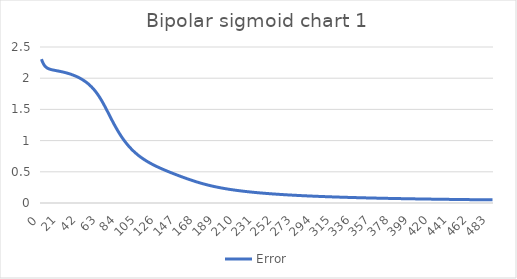
| Category | Error |
|---|---|
| 0.0 | 2.305 |
| 1.0 | 2.265 |
| 2.0 | 2.233 |
| 3.0 | 2.208 |
| 4.0 | 2.19 |
| 5.0 | 2.175 |
| 6.0 | 2.164 |
| 7.0 | 2.156 |
| 8.0 | 2.149 |
| 9.0 | 2.144 |
| 10.0 | 2.14 |
| 11.0 | 2.136 |
| 12.0 | 2.132 |
| 13.0 | 2.129 |
| 14.0 | 2.126 |
| 15.0 | 2.123 |
| 16.0 | 2.121 |
| 17.0 | 2.118 |
| 18.0 | 2.115 |
| 19.0 | 2.112 |
| 20.0 | 2.109 |
| 21.0 | 2.106 |
| 22.0 | 2.103 |
| 23.0 | 2.099 |
| 24.0 | 2.096 |
| 25.0 | 2.092 |
| 26.0 | 2.088 |
| 27.0 | 2.084 |
| 28.0 | 2.08 |
| 29.0 | 2.076 |
| 30.0 | 2.071 |
| 31.0 | 2.066 |
| 32.0 | 2.061 |
| 33.0 | 2.056 |
| 34.0 | 2.05 |
| 35.0 | 2.044 |
| 36.0 | 2.038 |
| 37.0 | 2.032 |
| 38.0 | 2.025 |
| 39.0 | 2.018 |
| 40.0 | 2.011 |
| 41.0 | 2.003 |
| 42.0 | 1.995 |
| 43.0 | 1.986 |
| 44.0 | 1.977 |
| 45.0 | 1.968 |
| 46.0 | 1.958 |
| 47.0 | 1.948 |
| 48.0 | 1.937 |
| 49.0 | 1.925 |
| 50.0 | 1.913 |
| 51.0 | 1.901 |
| 52.0 | 1.887 |
| 53.0 | 1.873 |
| 54.0 | 1.858 |
| 55.0 | 1.842 |
| 56.0 | 1.826 |
| 57.0 | 1.808 |
| 58.0 | 1.79 |
| 59.0 | 1.77 |
| 60.0 | 1.75 |
| 61.0 | 1.729 |
| 62.0 | 1.706 |
| 63.0 | 1.683 |
| 64.0 | 1.658 |
| 65.0 | 1.633 |
| 66.0 | 1.607 |
| 67.0 | 1.58 |
| 68.0 | 1.552 |
| 69.0 | 1.524 |
| 70.0 | 1.495 |
| 71.0 | 1.466 |
| 72.0 | 1.437 |
| 73.0 | 1.408 |
| 74.0 | 1.379 |
| 75.0 | 1.35 |
| 76.0 | 1.321 |
| 77.0 | 1.292 |
| 78.0 | 1.265 |
| 79.0 | 1.237 |
| 80.0 | 1.211 |
| 81.0 | 1.184 |
| 82.0 | 1.159 |
| 83.0 | 1.134 |
| 84.0 | 1.11 |
| 85.0 | 1.087 |
| 86.0 | 1.064 |
| 87.0 | 1.042 |
| 88.0 | 1.021 |
| 89.0 | 1 |
| 90.0 | 0.98 |
| 91.0 | 0.961 |
| 92.0 | 0.943 |
| 93.0 | 0.925 |
| 94.0 | 0.908 |
| 95.0 | 0.891 |
| 96.0 | 0.875 |
| 97.0 | 0.86 |
| 98.0 | 0.845 |
| 99.0 | 0.83 |
| 100.0 | 0.817 |
| 101.0 | 0.803 |
| 102.0 | 0.79 |
| 103.0 | 0.778 |
| 104.0 | 0.766 |
| 105.0 | 0.754 |
| 106.0 | 0.742 |
| 107.0 | 0.732 |
| 108.0 | 0.721 |
| 109.0 | 0.711 |
| 110.0 | 0.7 |
| 111.0 | 0.691 |
| 112.0 | 0.681 |
| 113.0 | 0.672 |
| 114.0 | 0.663 |
| 115.0 | 0.654 |
| 116.0 | 0.646 |
| 117.0 | 0.637 |
| 118.0 | 0.629 |
| 119.0 | 0.621 |
| 120.0 | 0.614 |
| 121.0 | 0.606 |
| 122.0 | 0.599 |
| 123.0 | 0.591 |
| 124.0 | 0.584 |
| 125.0 | 0.577 |
| 126.0 | 0.57 |
| 127.0 | 0.563 |
| 128.0 | 0.557 |
| 129.0 | 0.55 |
| 130.0 | 0.543 |
| 131.0 | 0.537 |
| 132.0 | 0.531 |
| 133.0 | 0.524 |
| 134.0 | 0.518 |
| 135.0 | 0.512 |
| 136.0 | 0.506 |
| 137.0 | 0.5 |
| 138.0 | 0.494 |
| 139.0 | 0.488 |
| 140.0 | 0.482 |
| 141.0 | 0.476 |
| 142.0 | 0.47 |
| 143.0 | 0.464 |
| 144.0 | 0.458 |
| 145.0 | 0.453 |
| 146.0 | 0.447 |
| 147.0 | 0.441 |
| 148.0 | 0.436 |
| 149.0 | 0.43 |
| 150.0 | 0.425 |
| 151.0 | 0.419 |
| 152.0 | 0.414 |
| 153.0 | 0.408 |
| 154.0 | 0.403 |
| 155.0 | 0.397 |
| 156.0 | 0.392 |
| 157.0 | 0.387 |
| 158.0 | 0.382 |
| 159.0 | 0.376 |
| 160.0 | 0.371 |
| 161.0 | 0.366 |
| 162.0 | 0.361 |
| 163.0 | 0.356 |
| 164.0 | 0.352 |
| 165.0 | 0.347 |
| 166.0 | 0.342 |
| 167.0 | 0.337 |
| 168.0 | 0.333 |
| 169.0 | 0.328 |
| 170.0 | 0.324 |
| 171.0 | 0.319 |
| 172.0 | 0.315 |
| 173.0 | 0.311 |
| 174.0 | 0.307 |
| 175.0 | 0.303 |
| 176.0 | 0.299 |
| 177.0 | 0.295 |
| 178.0 | 0.291 |
| 179.0 | 0.287 |
| 180.0 | 0.284 |
| 181.0 | 0.28 |
| 182.0 | 0.276 |
| 183.0 | 0.273 |
| 184.0 | 0.27 |
| 185.0 | 0.266 |
| 186.0 | 0.263 |
| 187.0 | 0.26 |
| 188.0 | 0.257 |
| 189.0 | 0.254 |
| 190.0 | 0.251 |
| 191.0 | 0.248 |
| 192.0 | 0.245 |
| 193.0 | 0.242 |
| 194.0 | 0.239 |
| 195.0 | 0.237 |
| 196.0 | 0.234 |
| 197.0 | 0.231 |
| 198.0 | 0.229 |
| 199.0 | 0.226 |
| 200.0 | 0.224 |
| 201.0 | 0.222 |
| 202.0 | 0.219 |
| 203.0 | 0.217 |
| 204.0 | 0.215 |
| 205.0 | 0.212 |
| 206.0 | 0.21 |
| 207.0 | 0.208 |
| 208.0 | 0.206 |
| 209.0 | 0.204 |
| 210.0 | 0.202 |
| 211.0 | 0.2 |
| 212.0 | 0.198 |
| 213.0 | 0.196 |
| 214.0 | 0.194 |
| 215.0 | 0.193 |
| 216.0 | 0.191 |
| 217.0 | 0.189 |
| 218.0 | 0.187 |
| 219.0 | 0.186 |
| 220.0 | 0.184 |
| 221.0 | 0.182 |
| 222.0 | 0.181 |
| 223.0 | 0.179 |
| 224.0 | 0.177 |
| 225.0 | 0.176 |
| 226.0 | 0.174 |
| 227.0 | 0.173 |
| 228.0 | 0.171 |
| 229.0 | 0.17 |
| 230.0 | 0.169 |
| 231.0 | 0.167 |
| 232.0 | 0.166 |
| 233.0 | 0.164 |
| 234.0 | 0.163 |
| 235.0 | 0.162 |
| 236.0 | 0.16 |
| 237.0 | 0.159 |
| 238.0 | 0.158 |
| 239.0 | 0.157 |
| 240.0 | 0.155 |
| 241.0 | 0.154 |
| 242.0 | 0.153 |
| 243.0 | 0.152 |
| 244.0 | 0.151 |
| 245.0 | 0.15 |
| 246.0 | 0.148 |
| 247.0 | 0.147 |
| 248.0 | 0.146 |
| 249.0 | 0.145 |
| 250.0 | 0.144 |
| 251.0 | 0.143 |
| 252.0 | 0.142 |
| 253.0 | 0.141 |
| 254.0 | 0.14 |
| 255.0 | 0.139 |
| 256.0 | 0.138 |
| 257.0 | 0.137 |
| 258.0 | 0.136 |
| 259.0 | 0.135 |
| 260.0 | 0.134 |
| 261.0 | 0.133 |
| 262.0 | 0.132 |
| 263.0 | 0.132 |
| 264.0 | 0.131 |
| 265.0 | 0.13 |
| 266.0 | 0.129 |
| 267.0 | 0.128 |
| 268.0 | 0.127 |
| 269.0 | 0.126 |
| 270.0 | 0.126 |
| 271.0 | 0.125 |
| 272.0 | 0.124 |
| 273.0 | 0.123 |
| 274.0 | 0.122 |
| 275.0 | 0.122 |
| 276.0 | 0.121 |
| 277.0 | 0.12 |
| 278.0 | 0.119 |
| 279.0 | 0.119 |
| 280.0 | 0.118 |
| 281.0 | 0.117 |
| 282.0 | 0.116 |
| 283.0 | 0.116 |
| 284.0 | 0.115 |
| 285.0 | 0.114 |
| 286.0 | 0.114 |
| 287.0 | 0.113 |
| 288.0 | 0.112 |
| 289.0 | 0.112 |
| 290.0 | 0.111 |
| 291.0 | 0.11 |
| 292.0 | 0.11 |
| 293.0 | 0.109 |
| 294.0 | 0.108 |
| 295.0 | 0.108 |
| 296.0 | 0.107 |
| 297.0 | 0.107 |
| 298.0 | 0.106 |
| 299.0 | 0.105 |
| 300.0 | 0.105 |
| 301.0 | 0.104 |
| 302.0 | 0.104 |
| 303.0 | 0.103 |
| 304.0 | 0.103 |
| 305.0 | 0.102 |
| 306.0 | 0.101 |
| 307.0 | 0.101 |
| 308.0 | 0.1 |
| 309.0 | 0.1 |
| 310.0 | 0.099 |
| 311.0 | 0.099 |
| 312.0 | 0.098 |
| 313.0 | 0.098 |
| 314.0 | 0.097 |
| 315.0 | 0.097 |
| 316.0 | 0.096 |
| 317.0 | 0.096 |
| 318.0 | 0.095 |
| 319.0 | 0.095 |
| 320.0 | 0.094 |
| 321.0 | 0.094 |
| 322.0 | 0.093 |
| 323.0 | 0.093 |
| 324.0 | 0.092 |
| 325.0 | 0.092 |
| 326.0 | 0.091 |
| 327.0 | 0.091 |
| 328.0 | 0.091 |
| 329.0 | 0.09 |
| 330.0 | 0.09 |
| 331.0 | 0.089 |
| 332.0 | 0.089 |
| 333.0 | 0.088 |
| 334.0 | 0.088 |
| 335.0 | 0.088 |
| 336.0 | 0.087 |
| 337.0 | 0.087 |
| 338.0 | 0.086 |
| 339.0 | 0.086 |
| 340.0 | 0.086 |
| 341.0 | 0.085 |
| 342.0 | 0.085 |
| 343.0 | 0.084 |
| 344.0 | 0.084 |
| 345.0 | 0.084 |
| 346.0 | 0.083 |
| 347.0 | 0.083 |
| 348.0 | 0.082 |
| 349.0 | 0.082 |
| 350.0 | 0.082 |
| 351.0 | 0.081 |
| 352.0 | 0.081 |
| 353.0 | 0.081 |
| 354.0 | 0.08 |
| 355.0 | 0.08 |
| 356.0 | 0.08 |
| 357.0 | 0.079 |
| 358.0 | 0.079 |
| 359.0 | 0.079 |
| 360.0 | 0.078 |
| 361.0 | 0.078 |
| 362.0 | 0.078 |
| 363.0 | 0.077 |
| 364.0 | 0.077 |
| 365.0 | 0.077 |
| 366.0 | 0.076 |
| 367.0 | 0.076 |
| 368.0 | 0.076 |
| 369.0 | 0.075 |
| 370.0 | 0.075 |
| 371.0 | 0.075 |
| 372.0 | 0.074 |
| 373.0 | 0.074 |
| 374.0 | 0.074 |
| 375.0 | 0.073 |
| 376.0 | 0.073 |
| 377.0 | 0.073 |
| 378.0 | 0.072 |
| 379.0 | 0.072 |
| 380.0 | 0.072 |
| 381.0 | 0.072 |
| 382.0 | 0.071 |
| 383.0 | 0.071 |
| 384.0 | 0.071 |
| 385.0 | 0.07 |
| 386.0 | 0.07 |
| 387.0 | 0.07 |
| 388.0 | 0.07 |
| 389.0 | 0.069 |
| 390.0 | 0.069 |
| 391.0 | 0.069 |
| 392.0 | 0.069 |
| 393.0 | 0.068 |
| 394.0 | 0.068 |
| 395.0 | 0.068 |
| 396.0 | 0.068 |
| 397.0 | 0.067 |
| 398.0 | 0.067 |
| 399.0 | 0.067 |
| 400.0 | 0.067 |
| 401.0 | 0.066 |
| 402.0 | 0.066 |
| 403.0 | 0.066 |
| 404.0 | 0.066 |
| 405.0 | 0.065 |
| 406.0 | 0.065 |
| 407.0 | 0.065 |
| 408.0 | 0.065 |
| 409.0 | 0.064 |
| 410.0 | 0.064 |
| 411.0 | 0.064 |
| 412.0 | 0.064 |
| 413.0 | 0.063 |
| 414.0 | 0.063 |
| 415.0 | 0.063 |
| 416.0 | 0.063 |
| 417.0 | 0.062 |
| 418.0 | 0.062 |
| 419.0 | 0.062 |
| 420.0 | 0.062 |
| 421.0 | 0.062 |
| 422.0 | 0.061 |
| 423.0 | 0.061 |
| 424.0 | 0.061 |
| 425.0 | 0.061 |
| 426.0 | 0.061 |
| 427.0 | 0.06 |
| 428.0 | 0.06 |
| 429.0 | 0.06 |
| 430.0 | 0.06 |
| 431.0 | 0.06 |
| 432.0 | 0.059 |
| 433.0 | 0.059 |
| 434.0 | 0.059 |
| 435.0 | 0.059 |
| 436.0 | 0.058 |
| 437.0 | 0.058 |
| 438.0 | 0.058 |
| 439.0 | 0.058 |
| 440.0 | 0.058 |
| 441.0 | 0.058 |
| 442.0 | 0.057 |
| 443.0 | 0.057 |
| 444.0 | 0.057 |
| 445.0 | 0.057 |
| 446.0 | 0.057 |
| 447.0 | 0.056 |
| 448.0 | 0.056 |
| 449.0 | 0.056 |
| 450.0 | 0.056 |
| 451.0 | 0.056 |
| 452.0 | 0.055 |
| 453.0 | 0.055 |
| 454.0 | 0.055 |
| 455.0 | 0.055 |
| 456.0 | 0.055 |
| 457.0 | 0.055 |
| 458.0 | 0.054 |
| 459.0 | 0.054 |
| 460.0 | 0.054 |
| 461.0 | 0.054 |
| 462.0 | 0.054 |
| 463.0 | 0.054 |
| 464.0 | 0.053 |
| 465.0 | 0.053 |
| 466.0 | 0.053 |
| 467.0 | 0.053 |
| 468.0 | 0.053 |
| 469.0 | 0.053 |
| 470.0 | 0.052 |
| 471.0 | 0.052 |
| 472.0 | 0.052 |
| 473.0 | 0.052 |
| 474.0 | 0.052 |
| 475.0 | 0.052 |
| 476.0 | 0.051 |
| 477.0 | 0.051 |
| 478.0 | 0.051 |
| 479.0 | 0.051 |
| 480.0 | 0.051 |
| 481.0 | 0.051 |
| 482.0 | 0.051 |
| 483.0 | 0.05 |
| 484.0 | 0.05 |
| 485.0 | 0.05 |
| 486.0 | 0.05 |